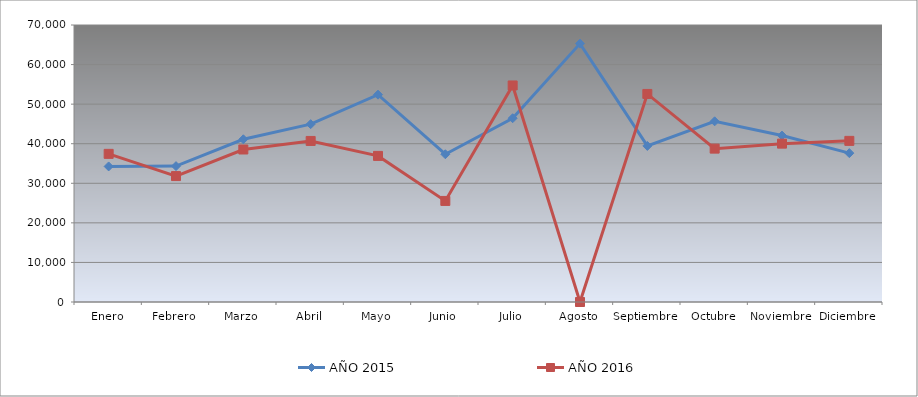
| Category | AÑO 2015 | AÑO 2016 |
|---|---|---|
| Enero | 34260 | 37440 |
| Febrero | 34340 | 31820 |
| Marzo | 41120 | 38540 |
| Abril | 44940 | 40700 |
| Mayo | 52400 | 36920 |
| Junio | 37340 | 25540 |
| Julio | 46440 | 54720 |
| Agosto | 65300 | 0 |
| Septiembre | 39440 | 52580 |
| Octubre | 45660 | 38760 |
| Noviembre | 42060 | 40020 |
| Diciembre | 37620 | 40720 |